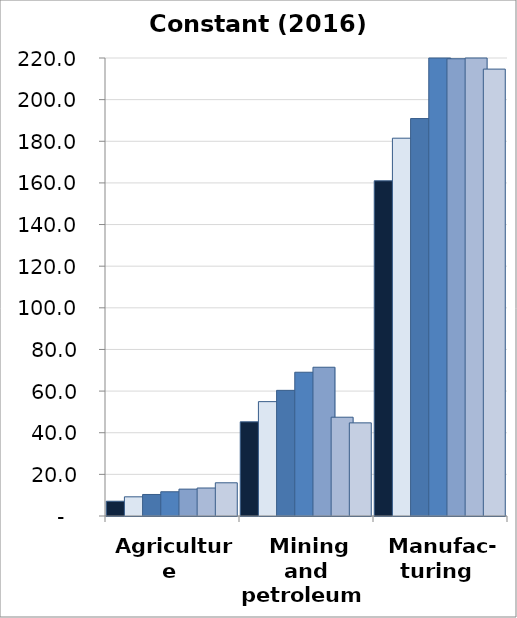
| Category | 2010 | 2011 | 2012 | 2013 | 2014 | 2015 | 2016 |
|---|---|---|---|---|---|---|---|
| Agriculture | 7.093 | 9.215 | 10.341 | 11.643 | 12.907 | 13.448 | 15.951 |
| Mining and
petroleum | 45.23 | 54.938 | 60.354 | 69.051 | 71.459 | 47.456 | 44.735 |
| Manufac-
turing | 161.012 | 181.481 | 190.916 | 227.876 | 219.644 | 234.727 | 214.666 |